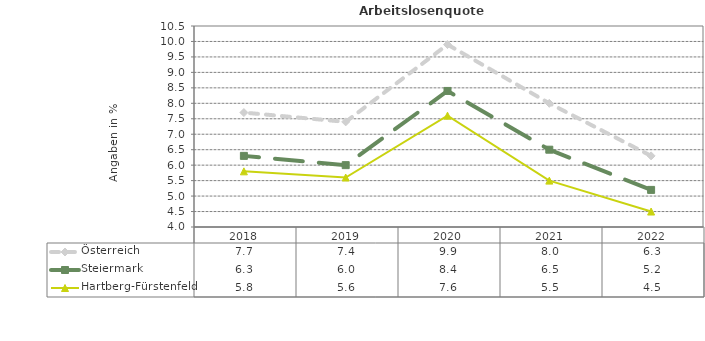
| Category | Österreich | Steiermark | Hartberg-Fürstenfeld |
|---|---|---|---|
| 2022.0 | 6.3 | 5.2 | 4.5 |
| 2021.0 | 8 | 6.5 | 5.5 |
| 2020.0 | 9.9 | 8.4 | 7.6 |
| 2019.0 | 7.4 | 6 | 5.6 |
| 2018.0 | 7.7 | 6.3 | 5.8 |